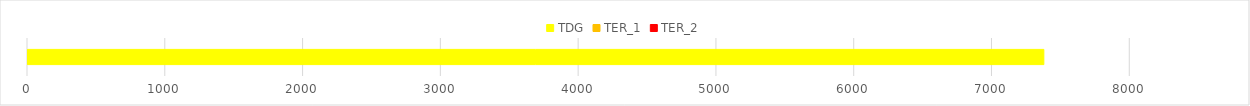
| Category | TDG | TER_1 | TER_2 |
|---|---|---|---|
| 0 | 7380 | 0 | 0 |